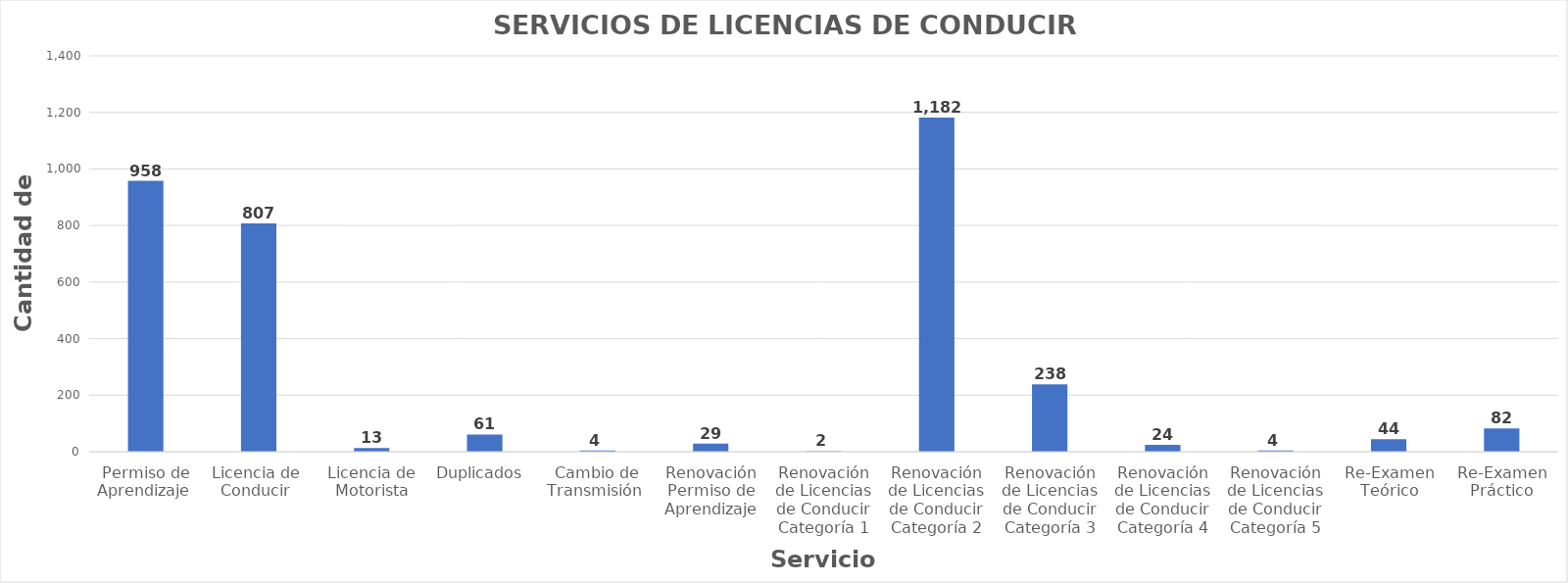
| Category | Series 0 |
|---|---|
| Permiso de Aprendizaje  | 958 |
| Licencia de  Conducir  | 807 |
| Licencia de Motorista | 13 |
| Duplicados  | 61 |
| Cambio de Transmisión  | 4 |
| Renovación Permiso de Aprendizaje | 29 |
| Renovación de Licencias de Conducir Categoría 1 | 2 |
| Renovación de Licencias de Conducir Categoría 2 | 1182 |
| Renovación de Licencias de Conducir Categoría 3 | 238 |
| Renovación de Licencias de Conducir Categoría 4 | 24 |
| Renovación de Licencias de Conducir Categoría 5 | 4 |
| Re-Examen Teórico | 44 |
| Re-Examen Práctico | 82 |